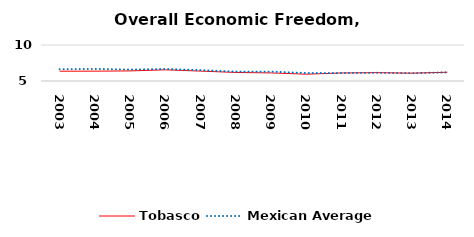
| Category | Tobasco | Mexican Average  |
|---|---|---|
| 2003.0 | 6.359 | 6.632 |
| 2004.0 | 6.367 | 6.678 |
| 2005.0 | 6.401 | 6.582 |
| 2006.0 | 6.553 | 6.668 |
| 2007.0 | 6.373 | 6.508 |
| 2008.0 | 6.186 | 6.3 |
| 2009.0 | 6.124 | 6.3 |
| 2010.0 | 5.948 | 6.105 |
| 2011.0 | 6.117 | 6.103 |
| 2012.0 | 6.16 | 6.144 |
| 2013.0 | 6.09 | 6.087 |
| 2014.0 | 6.216 | 6.195 |